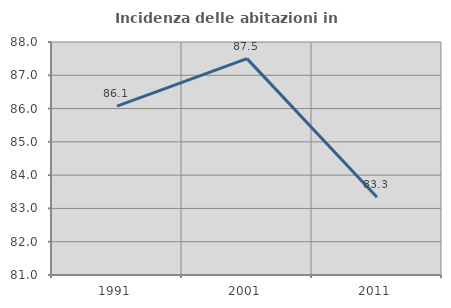
| Category | Incidenza delle abitazioni in proprietà  |
|---|---|
| 1991.0 | 86.076 |
| 2001.0 | 87.5 |
| 2011.0 | 83.333 |